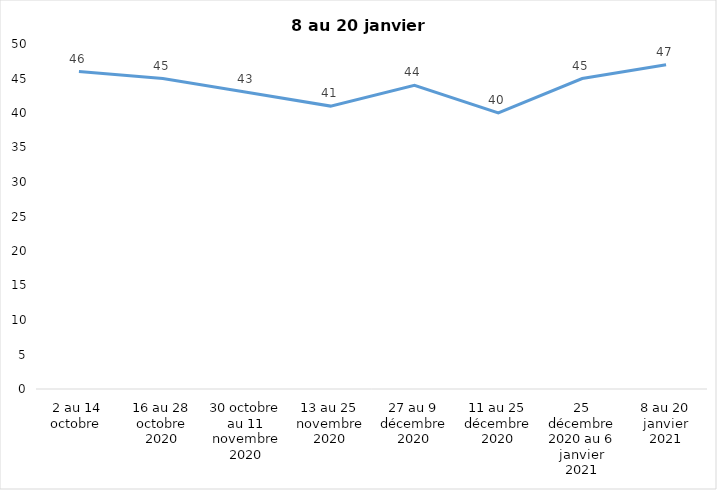
| Category | Toujours aux trois mesures |
|---|---|
| 2 au 14 octobre  | 46 |
| 16 au 28 octobre 2020 | 45 |
| 30 octobre au 11 novembre 2020 | 43 |
| 13 au 25 novembre 2020 | 41 |
| 27 au 9 décembre 2020 | 44 |
| 11 au 25 décembre 2020 | 40 |
| 25 décembre 2020 au 6 janvier 2021 | 45 |
| 8 au 20 janvier 2021 | 47 |